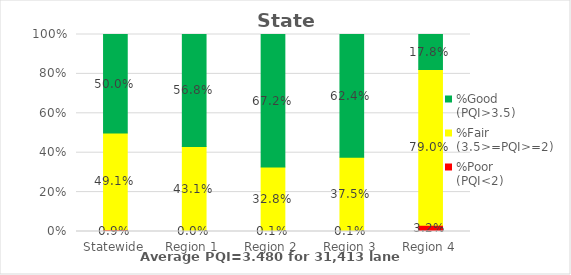
| Category | %Poor
(PQI<2) | %Fair
(3.5>=PQI>=2) | %Good
(PQI>3.5) |
|---|---|---|---|
| Statewide | 0.009 | 0.491 | 0.5 |
| Region 1 | 0 | 0.431 | 0.568 |
| Region 2 | 0.001 | 0.328 | 0.672 |
| Region 3 | 0.001 | 0.375 | 0.624 |
| Region 4 | 0.032 | 0.79 | 0.178 |